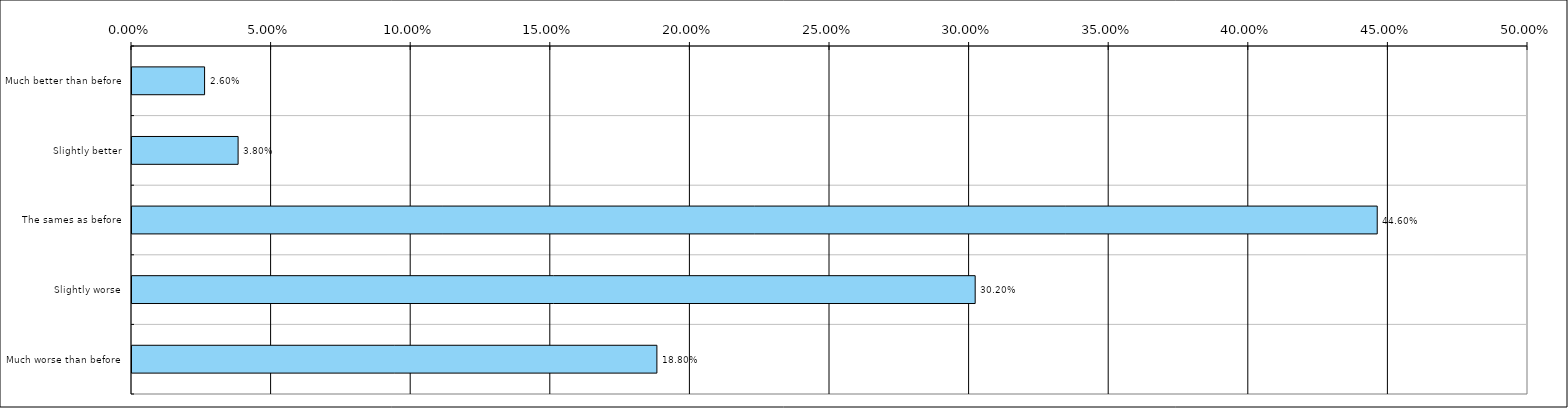
| Category | Total(United Kingdom) |
|---|---|
| Much better than before | 0.026 |
| Slightly better | 0.038 |
| The sames as before | 0.446 |
| Slightly worse | 0.302 |
| Much worse than before | 0.188 |